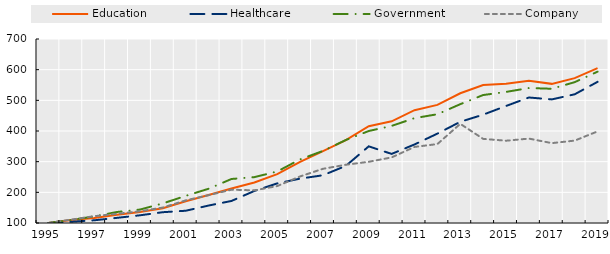
| Category | Education | Healthcare | Government | Company |
|---|---|---|---|---|
| 1995.0 | 100 | 100 | 100 | 100 |
| 1996.0 | 109.932 | 104.079 | 110.028 | 111.197 |
| 1997.0 | 116.556 | 108.816 | 121.522 | 122.14 |
| 1998.0 | 126.921 | 116.842 | 135.969 | 130.048 |
| 1999.0 | 135.587 | 125.114 | 143.801 | 138.411 |
| 2000.0 | 148.378 | 135.22 | 163.895 | 150.381 |
| 2001.0 | 170.685 | 139.959 | 188.441 | 173.771 |
| 2002.0 | 191.08 | 156.895 | 211.736 | 190.75 |
| 2003.0 | 212.401 | 171.84 | 243.542 | 208.73 |
| 2004.0 | 231.972 | 204.471 | 249.574 | 206.388 |
| 2005.0 | 259.56 | 229.147 | 267.981 | 220.436 |
| 2006.0 | 299.281 | 244.697 | 307.473 | 251.907 |
| 2007.0 | 334.617 | 255.707 | 335.117 | 276.751 |
| 2008.0 | 370.003 | 286.35 | 370.697 | 289.944 |
| 2009.0 | 415.813 | 350.015 | 399.972 | 299.611 |
| 2010.0 | 431.591 | 325.307 | 416.655 | 313.918 |
| 2011.0 | 467.835 | 356.126 | 441.896 | 348.104 |
| 2012.0 | 485.046 | 391.438 | 454.714 | 357.408 |
| 2013.0 | 523.124 | 429.977 | 487.485 | 423.357 |
| 2014.0 | 549.774 | 453.261 | 517.275 | 374.322 |
| 2015.0 | 554.222 | 481.562 | 527.449 | 368.324 |
| 2016.0 | 563.611 | 509.249 | 540.113 | 375.242 |
| 2017.0 | 553.719 | 503.036 | 537.723 | 360.437 |
| 2018.0 | 572.37 | 519.692 | 559.243 | 368.692 |
| 2019.0 | 605.026 | 560.283 | 593.494 | 398.702 |